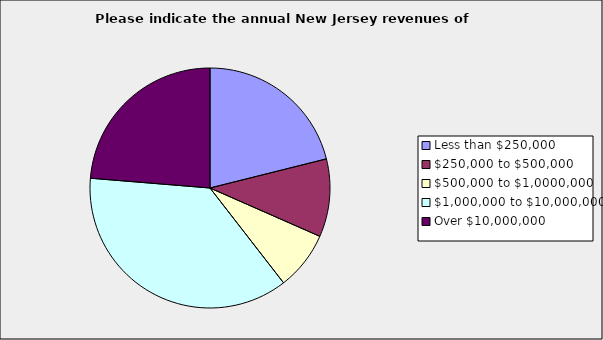
| Category | Series 0 |
|---|---|
| Less than $250,000 | 0.211 |
| $250,000 to $500,000 | 0.105 |
| $500,000 to $1,0000,000 | 0.079 |
| $1,000,000 to $10,000,000 | 0.368 |
| Over $10,000,000 | 0.237 |